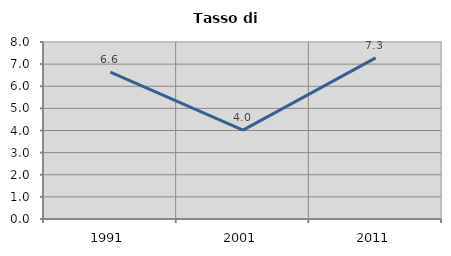
| Category | Tasso di disoccupazione   |
|---|---|
| 1991.0 | 6.633 |
| 2001.0 | 4.019 |
| 2011.0 | 7.282 |